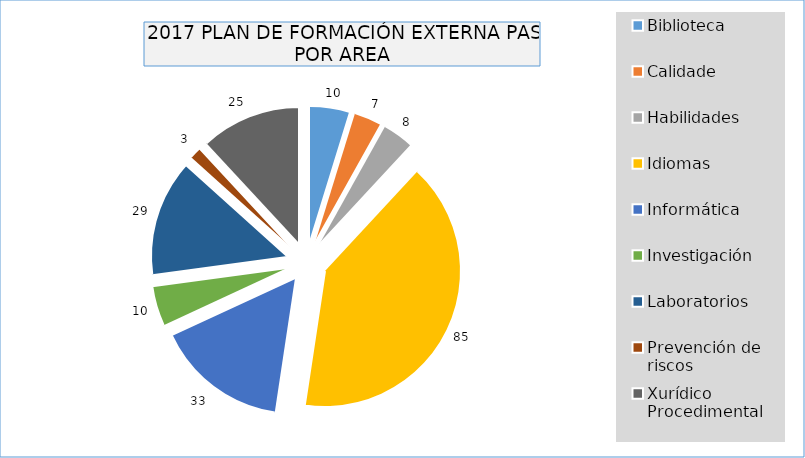
| Category | Series 0 |
|---|---|
| Biblioteca | 10 |
| Calidade | 7 |
| Habilidades | 8 |
| Idiomas | 85 |
| Informática | 33 |
| Investigación | 10 |
| Laboratorios | 29 |
| Prevención de riscos | 3 |
| Xurídico Procedimental | 25 |